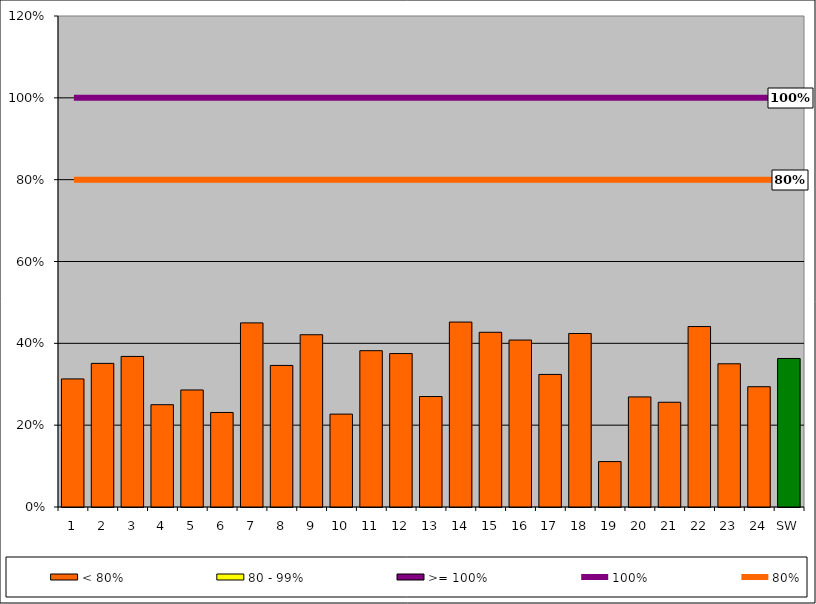
| Category | < 80% | 80 - 99% | >= 100% |
|---|---|---|---|
| 1 | 0.313 | 0 | 0 |
| 2 | 0.351 | 0 | 0 |
| 3 | 0.368 | 0 | 0 |
| 4 | 0.25 | 0 | 0 |
| 5 | 0.286 | 0 | 0 |
| 6 | 0.231 | 0 | 0 |
| 7 | 0.45 | 0 | 0 |
| 8 | 0.346 | 0 | 0 |
| 9 | 0.421 | 0 | 0 |
| 10 | 0.227 | 0 | 0 |
| 11 | 0.382 | 0 | 0 |
| 12 | 0.375 | 0 | 0 |
| 13 | 0.27 | 0 | 0 |
| 14 | 0.452 | 0 | 0 |
| 15 | 0.427 | 0 | 0 |
| 16 | 0.408 | 0 | 0 |
| 17 | 0.324 | 0 | 0 |
| 18 | 0.424 | 0 | 0 |
| 19 | 0.111 | 0 | 0 |
| 20 | 0.269 | 0 | 0 |
| 21 | 0.256 | 0 | 0 |
| 22 | 0.441 | 0 | 0 |
| 23 | 0.35 | 0 | 0 |
| 24 | 0.294 | 0 | 0 |
| SW | 0.363 | 0 | 0 |